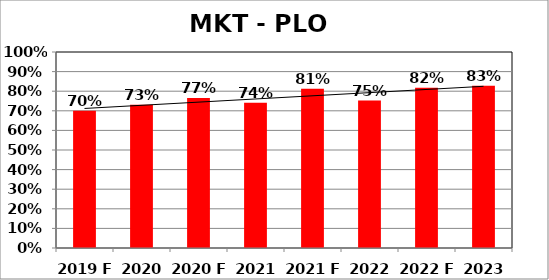
| Category | Series 0 |
|---|---|
| 2019 F | 0.7 |
| 2020 W | 0.731 |
| 2020 F | 0.766 |
| 2021 W | 0.742 |
| 2021 F | 0.812 |
| 2022 W | 0.752 |
| 2022 F | 0.817 |
| 2023 W | 0.828 |